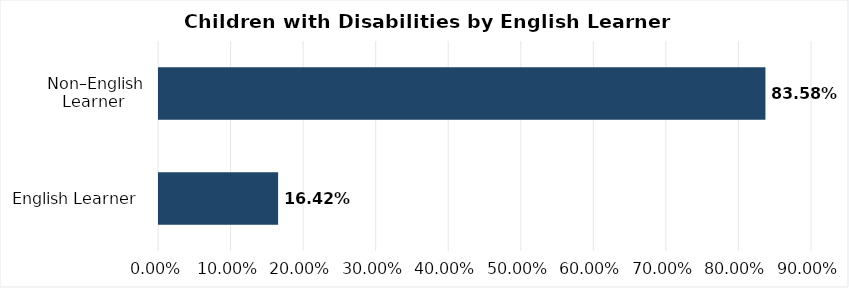
| Category | Series 0 |
|---|---|
| English Learner  | 0.164 |
| Non–English Learner  | 0.836 |